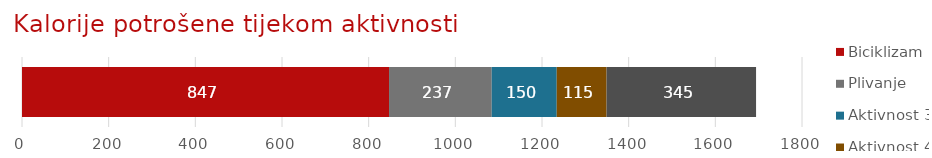
| Category | Biciklizam | Plivanje | Aktivnost 3 | Aktivnost 4 | Aktivnost 5 |
|---|---|---|---|---|---|
| Praćenje aktivnosti | 847 | 237 | 150 | 115 | 345 |